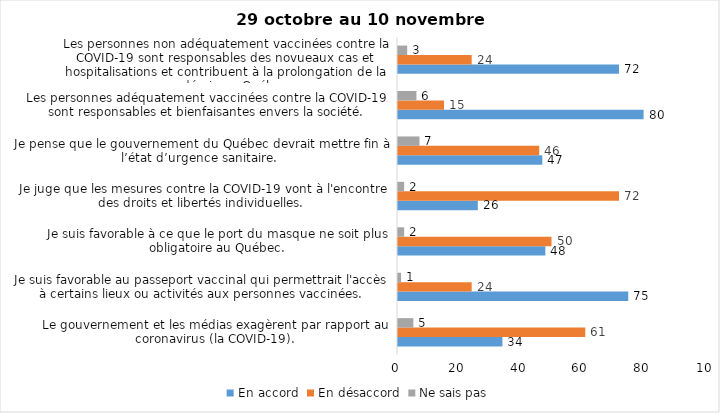
| Category | En accord | En désaccord | Ne sais pas |
|---|---|---|---|
| Le gouvernement et les médias exagèrent par rapport au coronavirus (la COVID-19). | 34 | 61 | 5 |
| Je suis favorable au passeport vaccinal qui permettrait l'accès à certains lieux ou activités aux personnes vaccinées. | 75 | 24 | 1 |
| Je suis favorable à ce que le port du masque ne soit plus obligatoire au Québec. | 48 | 50 | 2 |
| Je juge que les mesures contre la COVID-19 vont à l'encontre des droits et libertés individuelles.  | 26 | 72 | 2 |
| Je pense que le gouvernement du Québec devrait mettre fin à l’état d’urgence sanitaire.  | 47 | 46 | 7 |
| Les personnes adéquatement vaccinées contre la COVID-19 sont responsables et bienfaisantes envers la société. | 80 | 15 | 6 |
| Les personnes non adéquatement vaccinées contre la COVID-19 sont responsables des novueaux cas et hospitalisations et contribuent à la prolongation de la pandémie au Québec. | 72 | 24 | 3 |